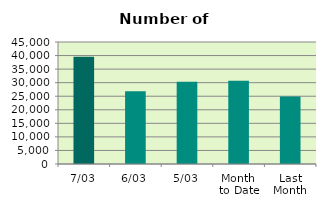
| Category | Series 0 |
|---|---|
| 7/03 | 39526 |
| 6/03 | 26840 |
| 5/03 | 30348 |
| Month 
to Date | 30740.4 |
| Last
Month | 24872.2 |